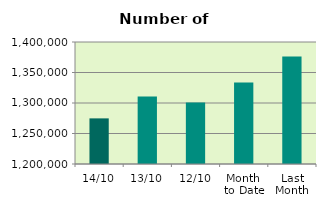
| Category | Series 0 |
|---|---|
| 14/10 | 1274788 |
| 13/10 | 1310486 |
| 12/10 | 1301008 |
| Month 
to Date | 1333565.8 |
| Last
Month | 1376245.636 |